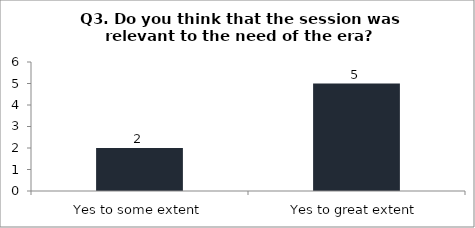
| Category | Q3. Do you think that the session was relevant to the need of the era? |
|---|---|
| Yes to some extent | 2 |
| Yes to great extent | 5 |